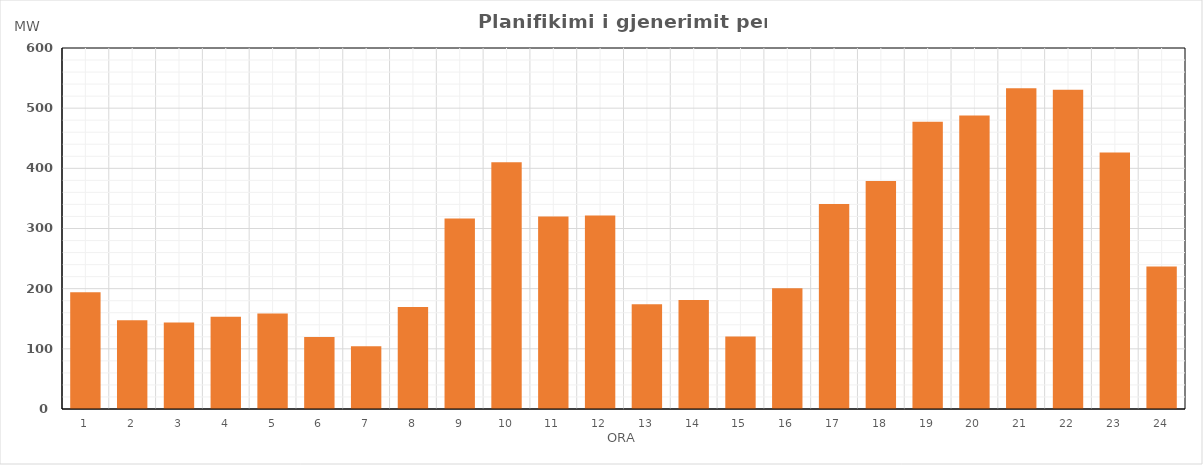
| Category | Max (MW) |
|---|---|
| 0 | 194.159 |
| 1 | 147.46 |
| 2 | 143.622 |
| 3 | 153.491 |
| 4 | 158.612 |
| 5 | 119.843 |
| 6 | 104.411 |
| 7 | 169.528 |
| 8 | 316.823 |
| 9 | 410.166 |
| 10 | 320.073 |
| 11 | 321.762 |
| 12 | 174.299 |
| 13 | 181.104 |
| 14 | 120.526 |
| 15 | 200.645 |
| 16 | 340.921 |
| 17 | 378.846 |
| 18 | 477.485 |
| 19 | 487.867 |
| 20 | 533.242 |
| 21 | 530.709 |
| 22 | 426.489 |
| 23 | 236.711 |